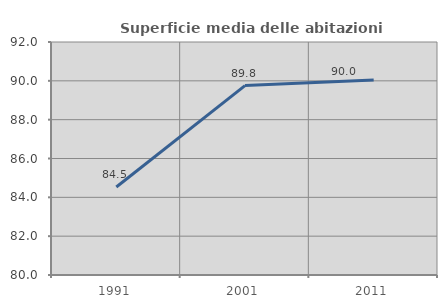
| Category | Superficie media delle abitazioni occupate |
|---|---|
| 1991.0 | 84.531 |
| 2001.0 | 89.757 |
| 2011.0 | 90.048 |